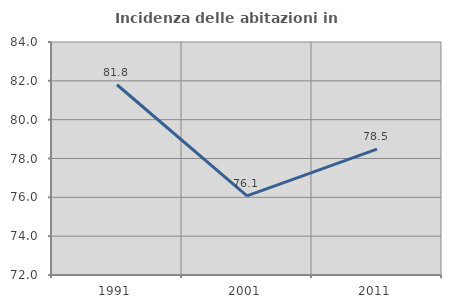
| Category | Incidenza delle abitazioni in proprietà  |
|---|---|
| 1991.0 | 81.798 |
| 2001.0 | 76.074 |
| 2011.0 | 78.481 |